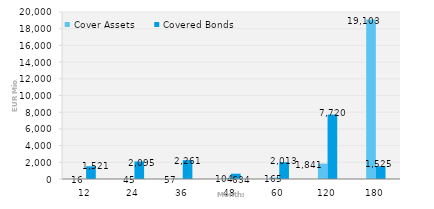
| Category | Cover Assets | Covered Bonds |
|---|---|---|
| 12.0 | 15.653 | 1521 |
| 24.0 | 44.929 | 2094.5 |
| 36.0 | 56.896 | 2260.5 |
| 48.0 | 103.523 | 633.98 |
| 60.0 | 165.446 | 2012.667 |
| 120.0 | 1841.48 | 7719.626 |
| 180.0 | 19103.288 | 1525 |